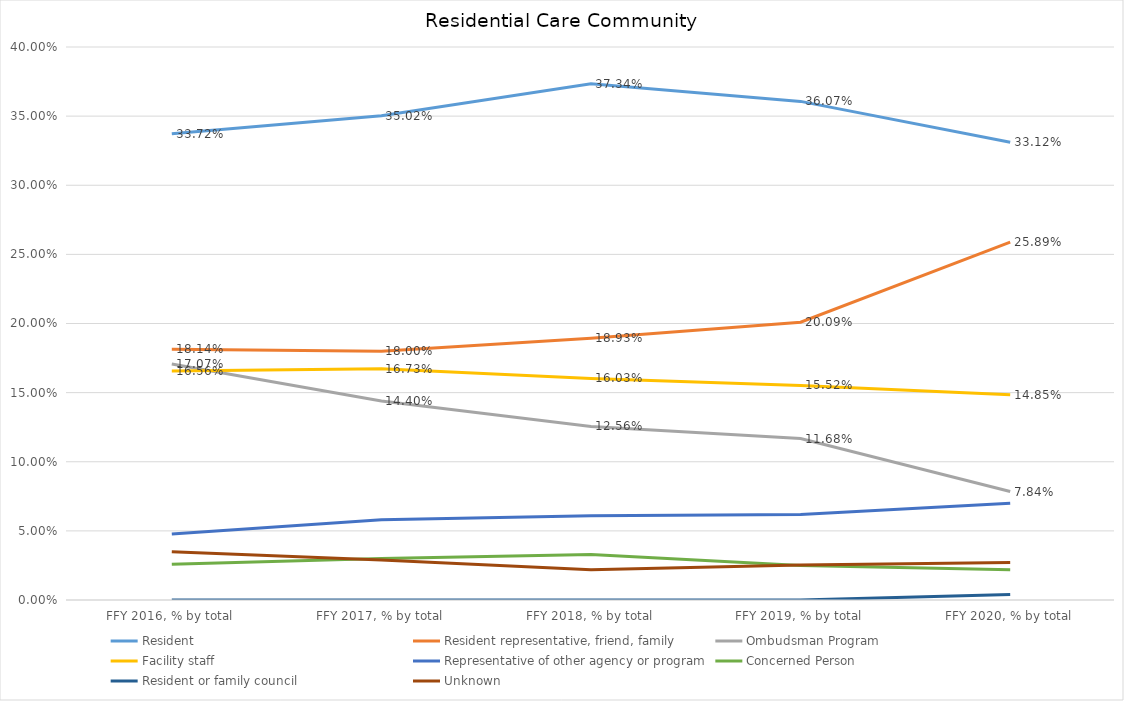
| Category | Resident | Resident representative, friend, family | Ombudsman Program | Facility staff | Representative of other agency or program | Concerned Person | Resident or family council | Unknown |
|---|---|---|---|---|---|---|---|---|
| FFY 2016, % by total | 0.337 | 0.181 | 0.171 | 0.166 | 0.048 | 0.026 | 0 | 0.035 |
| FFY 2017, % by total | 0.35 | 0.18 | 0.144 | 0.167 | 0.058 | 0.03 | 0 | 0.029 |
| FFY 2018, % by total | 0.373 | 0.189 | 0.126 | 0.16 | 0.061 | 0.033 | 0 | 0.022 |
| FFY 2019, % by total | 0.361 | 0.201 | 0.117 | 0.155 | 0.062 | 0.025 | 0 | 0.025 |
| FFY 2020, % by total | 0.331 | 0.259 | 0.078 | 0.148 | 0.07 | 0.022 | 0.004 | 0.027 |